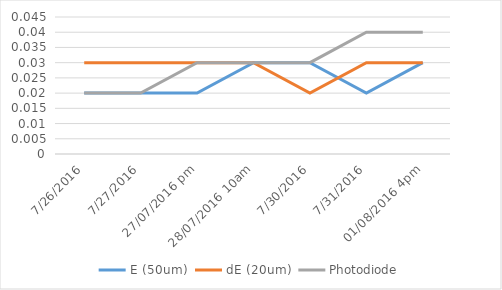
| Category | E (50um) | dE (20um) | Photodiode |
|---|---|---|---|
| 26/07/2016 | 0.02 | 0.03 | 0.02 |
| 27/07/2016 | 0.02 | 0.03 | 0.02 |
| 27/07/2016 pm | 0.02 | 0.03 | 0.03 |
| 28/07/2016 10am | 0.03 | 0.03 | 0.03 |
| 30/07/2016 | 0.03 | 0.02 | 0.03 |
| 31/07/2016 | 0.02 | 0.03 | 0.04 |
| 01/08/2016 4pm | 0.03 | 0.03 | 0.04 |